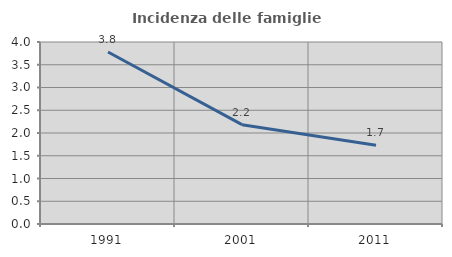
| Category | Incidenza delle famiglie numerose |
|---|---|
| 1991.0 | 3.78 |
| 2001.0 | 2.183 |
| 2011.0 | 1.73 |